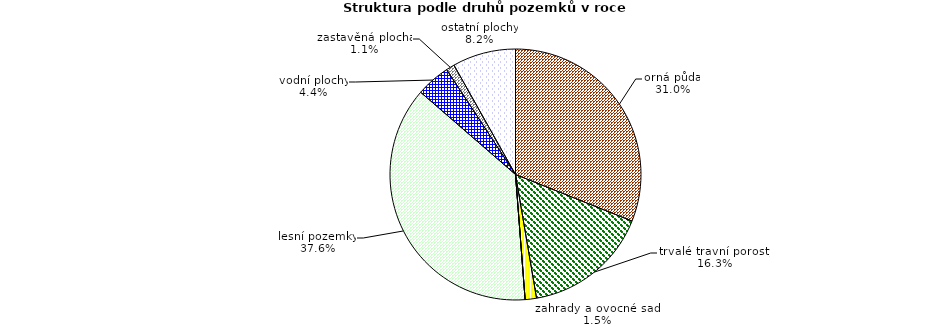
| Category | Struktura druhů pozemků |
|---|---|
| orná půda | 312284.65 |
| trvalé travní porosty | 163537.041 |
| zahrady a ovocné sady | 14704.878 |
| chmelnice a vinice | 0 |
| lesní pozemky | 378004.704 |
| vodní plochy | 44074.897 |
| zastavěná plocha | 10958.261 |
| ostatní plochy | 82070.993 |